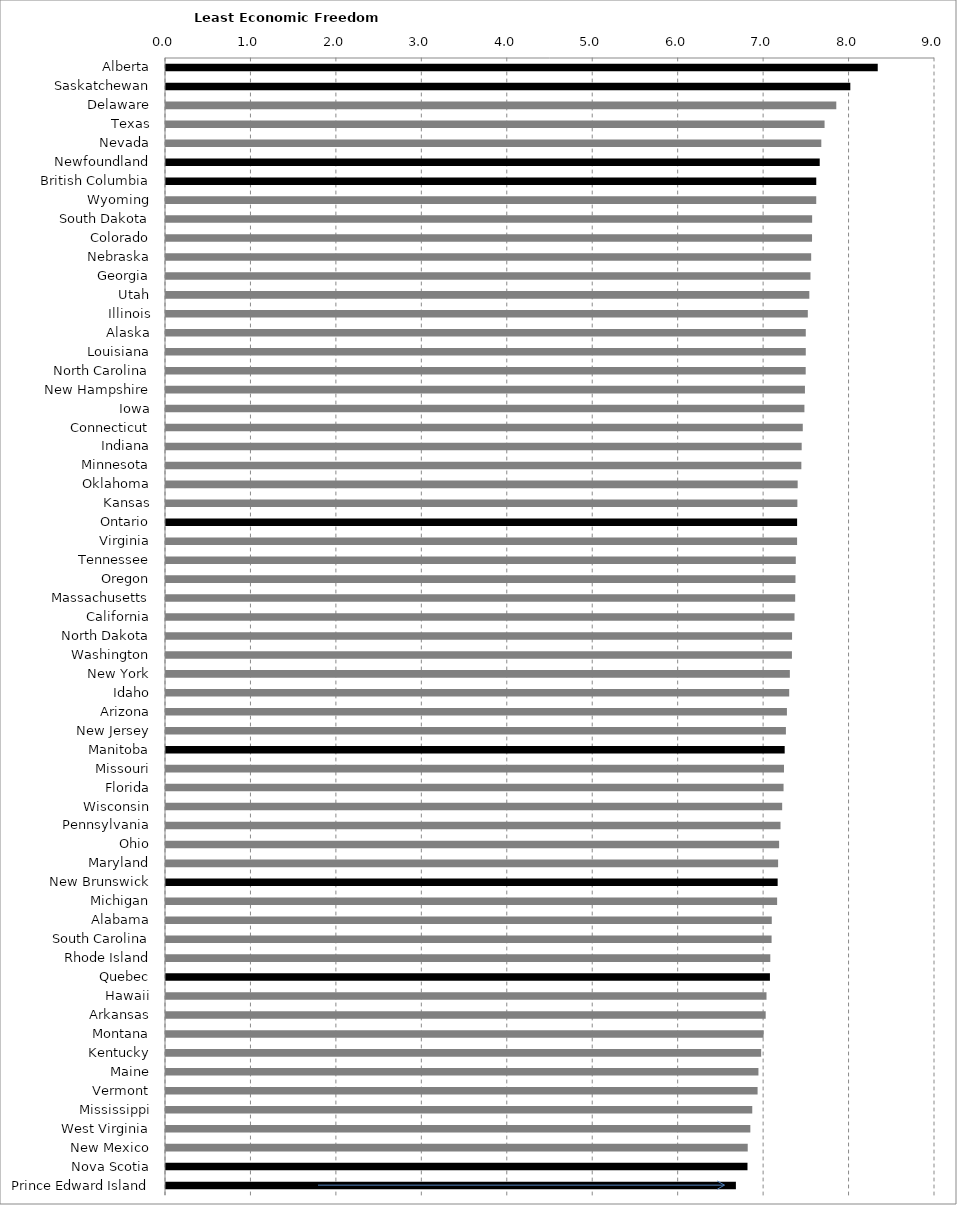
| Category | Series 0 |
|---|---|
| Alberta | 8.33 |
| Saskatchewan | 8.009 |
| Delaware | 7.845 |
| Texas | 7.708 |
| Nevada | 7.669 |
| Newfoundland | 7.651 |
| British Columbia | 7.61 |
| Wyoming | 7.61 |
| South Dakota | 7.562 |
| Colorado | 7.561 |
| Nebraska | 7.551 |
| Georgia | 7.543 |
| Utah | 7.529 |
| Illinois | 7.511 |
| Alaska | 7.488 |
| Louisiana | 7.488 |
| North Carolina | 7.487 |
| New Hampshire | 7.478 |
| Iowa | 7.472 |
| Connecticut | 7.453 |
| Indiana | 7.44 |
| Minnesota | 7.436 |
| Oklahoma | 7.393 |
| Kansas | 7.389 |
| Ontario | 7.386 |
| Virginia | 7.386 |
| Tennessee | 7.371 |
| Oregon | 7.367 |
| Massachusetts | 7.364 |
| California | 7.356 |
| North Dakota | 7.327 |
| Washington | 7.326 |
| New York | 7.301 |
| Idaho | 7.294 |
| Arizona | 7.267 |
| New Jersey | 7.255 |
| Manitoba | 7.241 |
| Missouri | 7.233 |
| Florida | 7.228 |
| Wisconsin | 7.211 |
| Pennsylvania | 7.192 |
| Ohio | 7.176 |
| Maryland | 7.164 |
| New Brunswick | 7.159 |
| Michigan | 7.152 |
| Alabama | 7.09 |
| South Carolina | 7.088 |
| Rhode Island | 7.072 |
| Quebec | 7.068 |
| Hawaii | 7.028 |
| Arkansas | 7.019 |
| Montana | 6.994 |
| Kentucky | 6.966 |
| Maine | 6.934 |
| Vermont | 6.924 |
| Mississippi | 6.861 |
| West Virginia | 6.839 |
| New Mexico | 6.808 |
| Nova Scotia | 6.805 |
| Prince Edward Island | 6.67 |